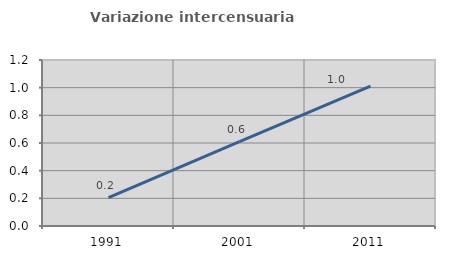
| Category | Variazione intercensuaria annua |
|---|---|
| 1991.0 | 0.205 |
| 2001.0 | 0.61 |
| 2011.0 | 1.011 |